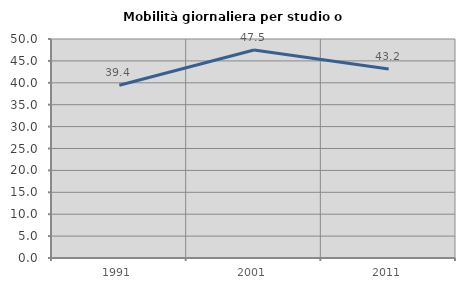
| Category | Mobilità giornaliera per studio o lavoro |
|---|---|
| 1991.0 | 39.445 |
| 2001.0 | 47.495 |
| 2011.0 | 43.155 |